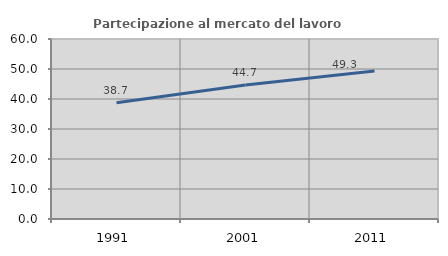
| Category | Partecipazione al mercato del lavoro  femminile |
|---|---|
| 1991.0 | 38.747 |
| 2001.0 | 44.672 |
| 2011.0 | 49.333 |